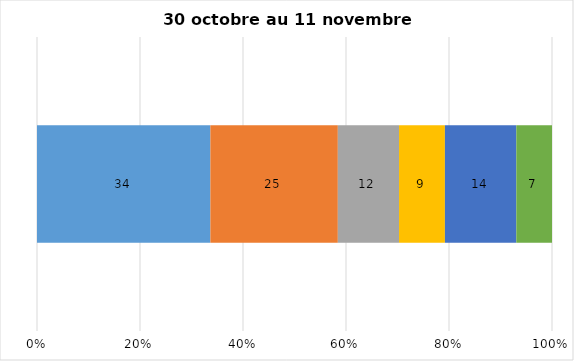
| Category | Plusieurs fois par jour | Une fois par jour | Quelques fois par semaine   | Une fois par semaine ou moins   |  Jamais   |  Je n’utilise pas les médias sociaux |
|---|---|---|---|---|---|---|
| 0 | 34 | 25 | 12 | 9 | 14 | 7 |